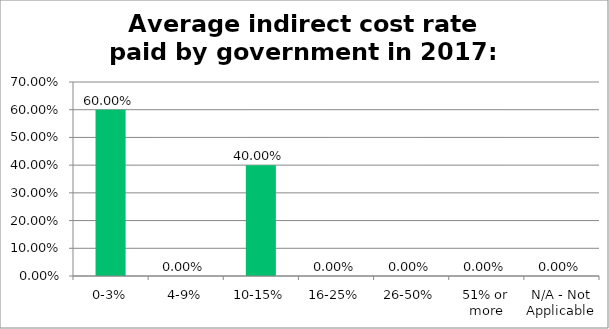
| Category | Responses |
|---|---|
| 0-3% | 0.6 |
| 4-9% | 0 |
| 10-15% | 0.4 |
| 16-25% | 0 |
| 26-50% | 0 |
| 51% or more | 0 |
| N/A - Not Applicable | 0 |